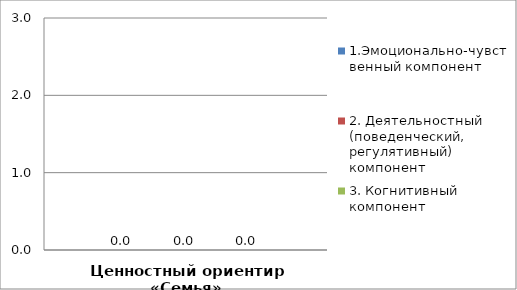
| Category | 1.Эмоционально-чувственный компонент | 2. Деятельностный (поведенческий, регулятивный) компонент | 3. Когнитивный компонент |
|---|---|---|---|
| Ценностный ориентир «Семья» | 0 | 0 | 0 |